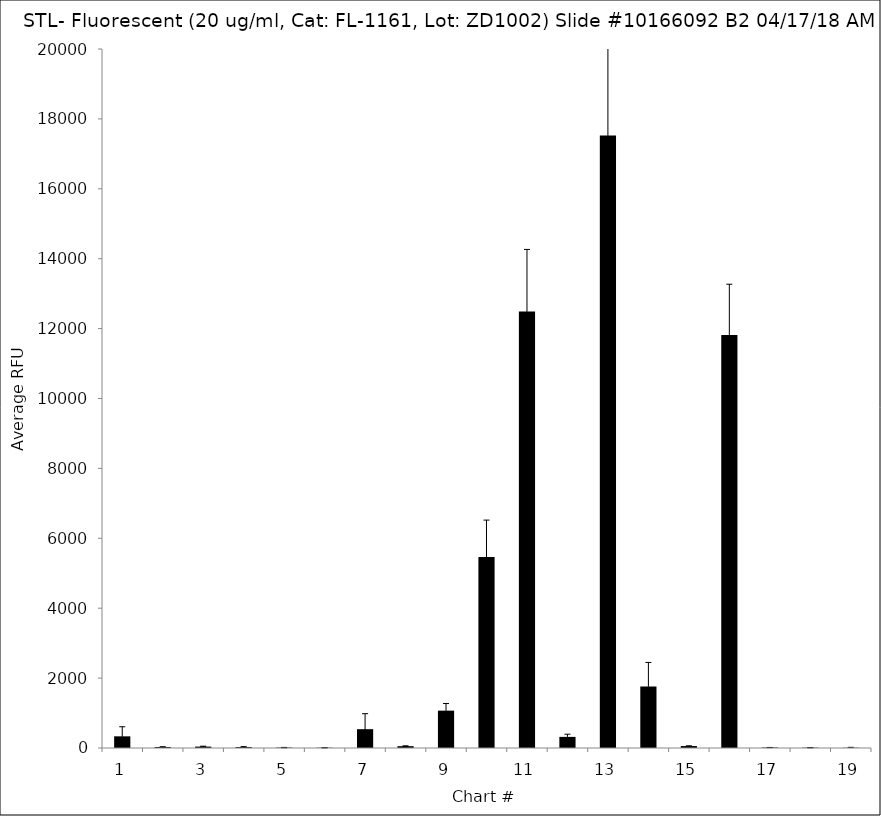
| Category | Series 0 |
|---|---|
| 1.0 | 333.75 |
| 2.0 | 28 |
| 3.0 | 40.25 |
| 4.0 | 27.5 |
| 5.0 | 11.5 |
| 6.0 | 7.25 |
| 7.0 | 538.5 |
| 8.0 | 52.5 |
| 9.0 | 1068.75 |
| 10.0 | 5463.5 |
| 11.0 | 12487.75 |
| 12.0 | 318 |
| 13.0 | 17522.5 |
| 14.0 | 1760 |
| 15.0 | 55.5 |
| 16.0 | 11819.5 |
| 17.0 | 13.5 |
| 18.0 | 9.5 |
| 19.0 | 7 |